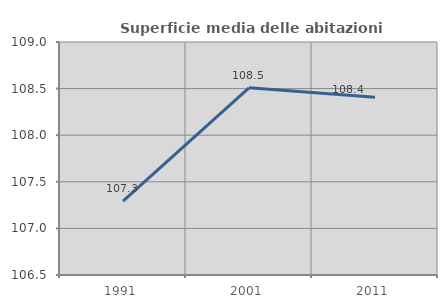
| Category | Superficie media delle abitazioni occupate |
|---|---|
| 1991.0 | 107.292 |
| 2001.0 | 108.509 |
| 2011.0 | 108.407 |